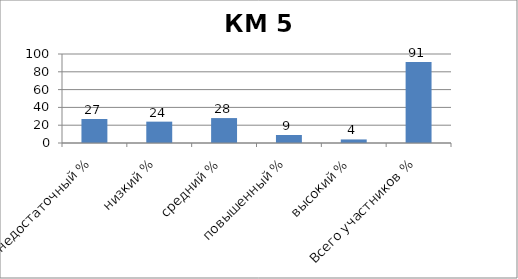
| Category | Series 0 |
|---|---|
| недостаточный % | 27 |
| низкий % | 24 |
| средний % | 28 |
| повышенный % | 9 |
| высокий % | 4 |
| Всего участников % | 91 |